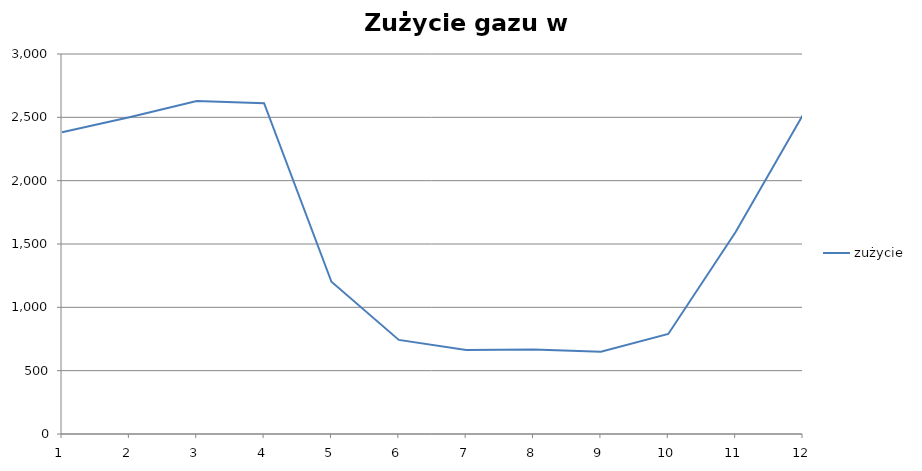
| Category | zużycie |
|---|---|
| 0 | 2383 |
| 1 | 2500 |
| 2 | 2628 |
| 3 | 2612 |
| 4 | 1202 |
| 5 | 743 |
| 6 | 664 |
| 7 | 668 |
| 8 | 650 |
| 9 | 790 |
| 10 | 1594 |
| 11 | 2521 |